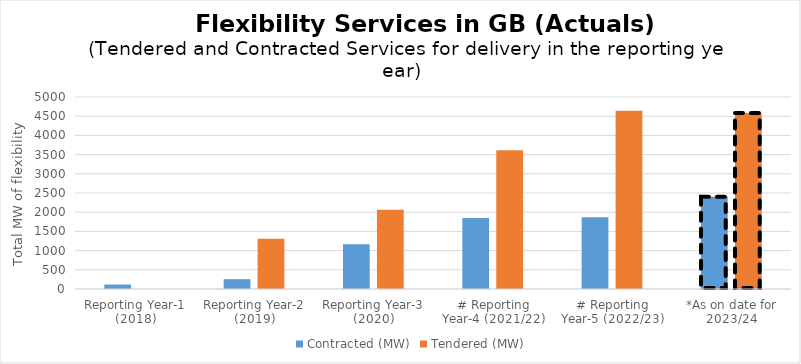
| Category | Contracted (MW) | Tendered (MW) |
|---|---|---|
| Reporting Year-1 (2018) | 116.1 | 0 |
| Reporting Year-2 (2019) | 256.15 | 1306.349 |
| Reporting Year-3 (2020) | 1165.547 | 2064.516 |
| # Reporting Year-4 (2021/22) | 1848 | 3615.8 |
| # Reporting Year-5 (2022/23) | 1870.5 | 4641 |
| *As on date for 2023/24 | 2400 | 4581.9 |